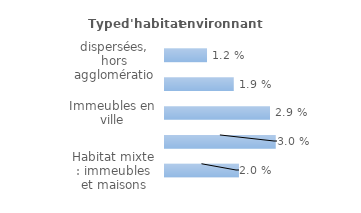
| Category | Series 0 |
|---|---|
| Maisons dispersées, hors agglomération | 0.012 |
| Maisons en lotissement, en quartier pavillonnaire | 0.019 |
| Immeubles en ville | 0.029 |
| Immeubles en cité ou grand ensemble | 0.03 |
| Habitat mixte : immeubles et maisons | 0.02 |